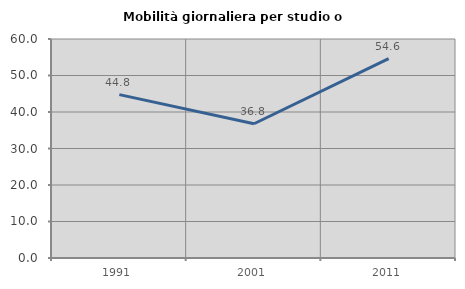
| Category | Mobilità giornaliera per studio o lavoro |
|---|---|
| 1991.0 | 44.767 |
| 2001.0 | 36.782 |
| 2011.0 | 54.615 |